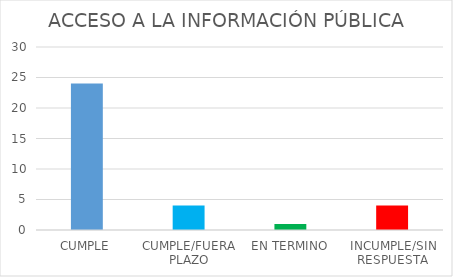
| Category | TOTAL |
|---|---|
| CUMPLE | 24 |
| CUMPLE/FUERA PLAZO | 4 |
| EN TERMINO | 1 |
| INCUMPLE/SIN RESPUESTA | 4 |